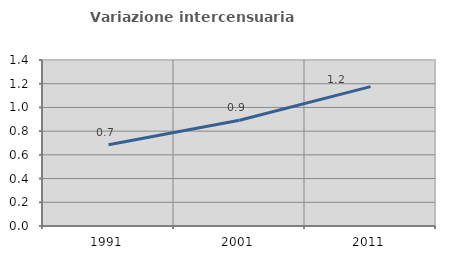
| Category | Variazione intercensuaria annua |
|---|---|
| 1991.0 | 0.686 |
| 2001.0 | 0.892 |
| 2011.0 | 1.176 |